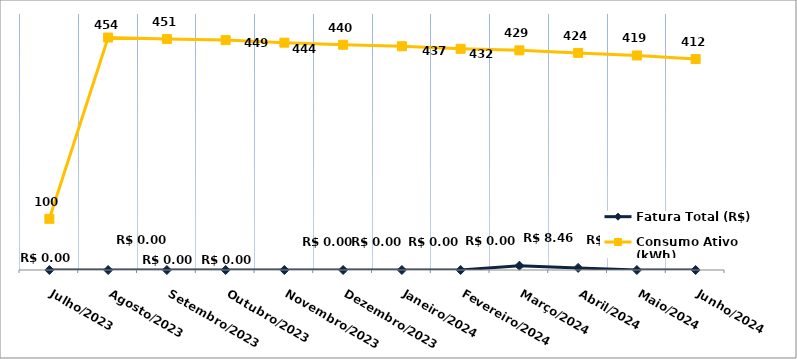
| Category | Fatura Total (R$) |
|---|---|
| Julho/2023 | 0 |
| Agosto/2023 | 0 |
| Setembro/2023 | 0 |
| Outubro/2023 | 0 |
| Novembro/2023 | 0 |
| Dezembro/2023 | 0 |
| Janeiro/2024 | 0 |
| Fevereiro/2024 | 0 |
| Março/2024 | 8.46 |
| Abril/2024 | 4.14 |
| Maio/2024 | 0 |
| Junho/2024 | 0 |